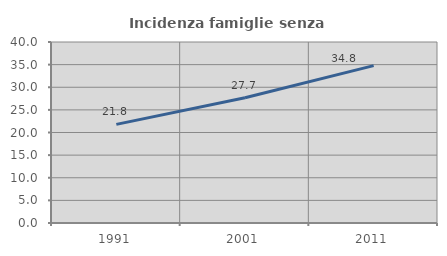
| Category | Incidenza famiglie senza nuclei |
|---|---|
| 1991.0 | 21.802 |
| 2001.0 | 27.686 |
| 2011.0 | 34.781 |